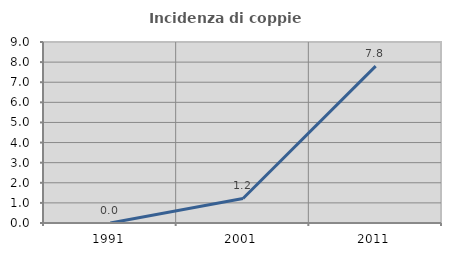
| Category | Incidenza di coppie miste |
|---|---|
| 1991.0 | 0 |
| 2001.0 | 1.22 |
| 2011.0 | 7.801 |